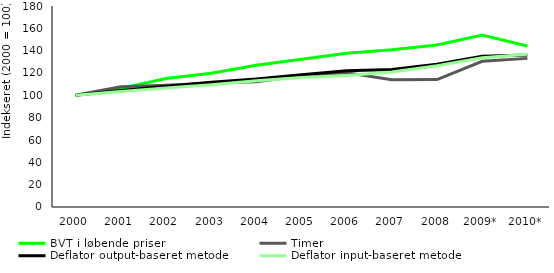
| Category | BVT i løbende priser | Timer | Deflator output-baseret metode | Deflator input-baseret metode |
|---|---|---|---|---|
| 2000 | 100 | 100 | 100 | 100 |
| 2001 | 106.128 | 107.615 | 104.369 | 103.486 |
| 2002 | 115.06 | 109.073 | 108.23 | 106.535 |
| 2003 | 119.694 | 110.833 | 111.669 | 109.514 |
| 2004 | 127.014 | 112.132 | 114.725 | 113.103 |
| 2005 | 132.234 | 117.602 | 118.524 | 116.022 |
| 2006 | 137.728 | 120.306 | 121.951 | 117.812 |
| 2007 | 140.918 | 114.018 | 123.109 | 120.879 |
| 2008 | 145.11 | 114.153 | 127.822 | 126.431 |
| 2009* | 154.033 | 130.506 | 135.07 | 133.66 |
| 2010* | 144.242 | 133.097 | 136.074 | 136.887 |